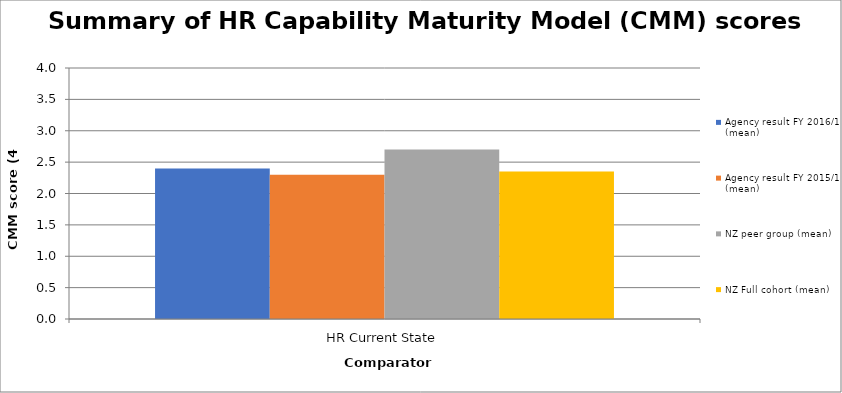
| Category | Agency result FY 2016/17 (mean) | Agency result FY 2015/16 (mean) | NZ peer group (mean) | NZ Full cohort (mean) |
|---|---|---|---|---|
| HR Current State | 2.4 | 2.3 | 2.7 | 2.35 |